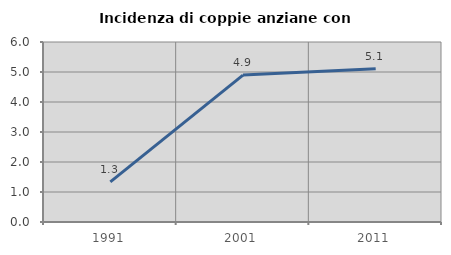
| Category | Incidenza di coppie anziane con figli |
|---|---|
| 1991.0 | 1.339 |
| 2001.0 | 4.898 |
| 2011.0 | 5.106 |